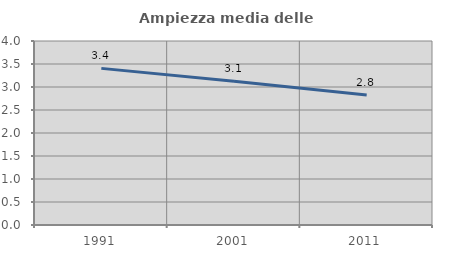
| Category | Ampiezza media delle famiglie |
|---|---|
| 1991.0 | 3.405 |
| 2001.0 | 3.124 |
| 2011.0 | 2.829 |